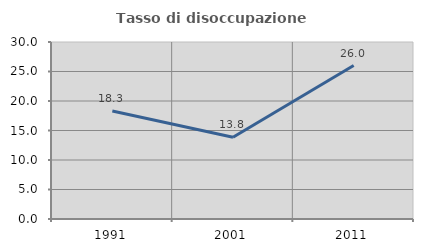
| Category | Tasso di disoccupazione giovanile  |
|---|---|
| 1991.0 | 18.317 |
| 2001.0 | 13.843 |
| 2011.0 | 26.009 |